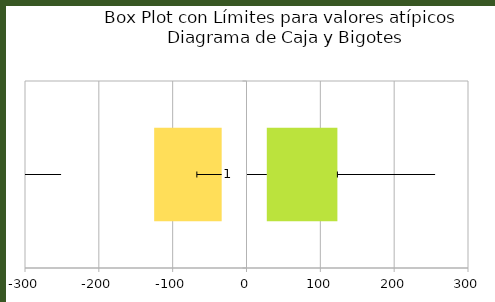
| Category | Series 0 | Series 1 | Series 2 | Series 3 | Series 4 | Series 5 | Series 6 |
|---|---|---|---|---|---|---|---|
| 0 | 0 | 27.5 | -33.621 | -91.429 | 95.607 | 132.343 | -126.076 |